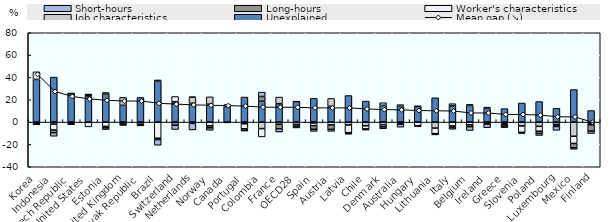
| Category | Unexplained | Job characteristics | Worker's characteristics | Long-hours | Short-hours |
|---|---|---|---|---|---|
| Korea | 38.213 | -1.03 | 6.796 | -1.006 | -0.018 |
| Indonesia | 40.288 | -1.832 | -5.305 | -2.354 | -3.186 |
| Czech Republic | 25.592 | -0.678 | -0.554 | -1.174 | 0.05 |
| United States | 22.982 | 0.797 | -4.289 | 0.725 | 0.635 |
| Estonia | 25.113 | 1.359 | -3.876 | -1.329 | -1.482 |
| United Kingdom | 14.984 | 7.153 | -0.638 | -1.173 | -1.242 |
| Slovak Republic | 22.029 | -0.657 | -1.5 | -0.742 | -0.051 |
| Brazil | 36.616 | 1.133 | -14.418 | -1.257 | -5.037 |
| Switzerland | 16.501 | 1.679 | 4.741 | -2.785 | -3.831 |
| Netherlands | 16.836 | 5.371 | 0.446 | -1.171 | -5.849 |
| Norway | 16.005 | 6.591 | -3.298 | -1.862 | -2.166 |
| Canada | 13.901 | 0.359 | -0.74 | 0.13 | 1.327 |
| Portugal | 22.421 | -1.513 | -4.512 | -1.471 | -0.419 |
| Colombia | 18.654 | -5.837 | -7.456 | 4.245 | 3.965 |
| France | 16.503 | 5.913 | -1.913 | -4.018 | -2.962 |
| OECD28 | 18.33 | 0.334 | -2.021 | -1.648 | -1.552 |
| Spain | 21.25 | -0.795 | -2.372 | -3.279 | -1.843 |
| Austria | 14.118 | 7.071 | -2.523 | -4.013 | -1.725 |
| Latvia | 23.766 | -2.62 | -6.846 | -0.601 | -0.79 |
| Chile | 18.802 | -3.3 | -2.892 | -0.528 | -0.105 |
| Denmark | 14.928 | 2.449 | -2.212 | -2.168 | -1.602 |
| Australia | 14.047 | 1.575 | -0.843 | -1.061 | -2.615 |
| Hungary | 14.036 | 0.334 | -3.325 | -0.253 | -0.217 |
| Lithuania | 21.779 | -5.371 | -4.996 | -0.217 | -0.854 |
| Italy | 14.663 | 1.828 | -3.468 | -1.424 | -1.5 |
| Belgium | 14.969 | 0.916 | -2.389 | -1.733 | -3.365 |
| Ireland | 12.228 | 1.178 | -1.045 | -0.735 | -3.277 |
| Greece | 12.062 | -1.351 | -0.879 | -1.365 | -1.381 |
| Slovenia | 17.077 | -3.456 | -5.734 | -0.44 | -0.409 |
| Poland | 18.416 | -3.812 | -4.359 | -2.043 | -1.736 |
| Luxembourg | 12.309 | -2.016 | -0.712 | -1.202 | -3.413 |
| Mexico | 29.146 | -12.682 | -6.442 | -3.873 | -1.306 |
| Finland | 10.356 | -1.32 | -1.212 | -5.543 | -2.164 |